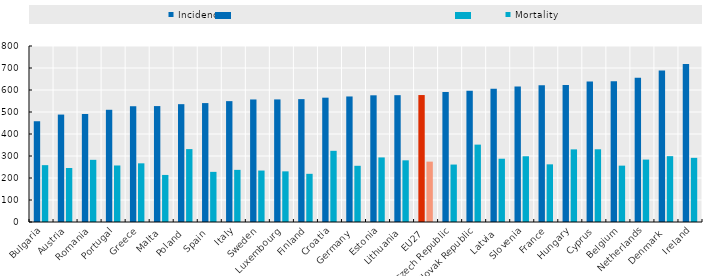
| Category | Incidence | Mortality |
|---|---|---|
| Bulgaria | 458 | 258.4 |
| Austria | 488.3 | 245.5 |
| Romania | 490.8 | 282.6 |
| Portugal | 510.1 | 256.9 |
| Greece | 526.2 | 266.7 |
| Malta | 526.9 | 213.9 |
| Poland | 535.6 | 331.4 |
| Spain | 540.5 | 227.9 |
| Italy | 549.4 | 237 |
| Sweden | 557 | 233.9 |
| Luxembourg | 557.2 | 230.2 |
| Finland | 558.5 | 219 |
| Croatia | 565.1 | 323.6 |
| Germany | 570.6 | 255.5 |
| Estonia | 575.9 | 293.5 |
| Lithuania | 576.5 | 280.3 |
| EU27 | 577.07 | 274.411 |
| Czech Republic | 590.5 | 261.1 |
| Slovak Republic | 596.3 | 351.7 |
| Latvia | 606.1 | 287.6 |
| Slovenia | 616 | 298.8 |
| France | 621.1 | 262.1 |
| Hungary | 623.1 | 330.1 |
| Cyprus | 639.1 | 330.6 |
| Belgium | 640.2 | 256.2 |
| Netherlands | 655.3 | 283.7 |
| Denmark | 688.3 | 299.3 |
| Ireland | 718.3 | 291.6 |